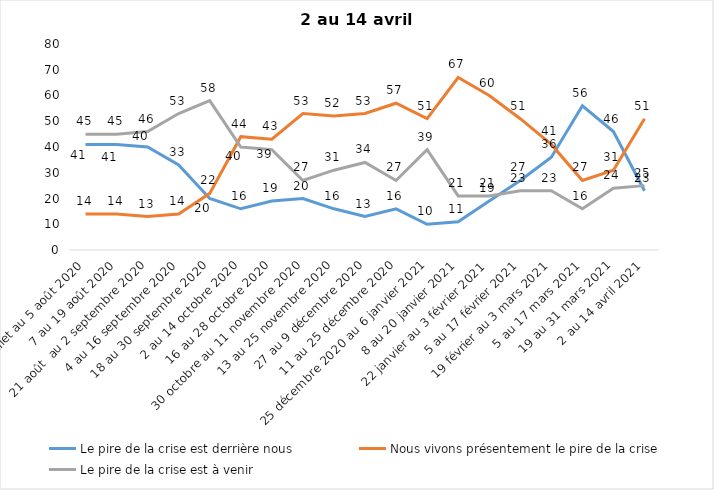
| Category | Le pire de la crise est derrière nous | Nous vivons présentement le pire de la crise | Le pire de la crise est à venir |
|---|---|---|---|
| 24 juillet au 5 août 2020 | 41 | 14 | 45 |
| 7 au 19 août 2020 | 41 | 14 | 45 |
| 21 août  au 2 septembre 2020 | 40 | 13 | 46 |
| 4 au 16 septembre 2020 | 33 | 14 | 53 |
| 18 au 30 septembre 2020 | 20 | 22 | 58 |
| 2 au 14 octobre 2020 | 16 | 44 | 40 |
| 16 au 28 octobre 2020 | 19 | 43 | 39 |
| 30 octobre au 11 novembre 2020 | 20 | 53 | 27 |
| 13 au 25 novembre 2020 | 16 | 52 | 31 |
| 27 au 9 décembre 2020 | 13 | 53 | 34 |
| 11 au 25 décembre 2020 | 16 | 57 | 27 |
| 25 décembre 2020 au 6 janvier 2021 | 10 | 51 | 39 |
| 8 au 20 janvier 2021 | 11 | 67 | 21 |
| 22 janvier au 3 février 2021 | 19 | 60 | 21 |
| 5 au 17 février 2021 | 27 | 51 | 23 |
| 19 février au 3 mars 2021 | 36 | 41 | 23 |
| 5 au 17 mars 2021 | 56 | 27 | 16 |
| 19 au 31 mars 2021 | 46 | 31 | 24 |
| 2 au 14 avril 2021 | 23 | 51 | 25 |